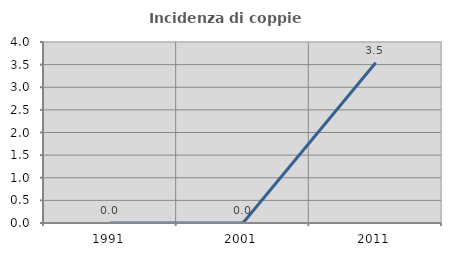
| Category | Incidenza di coppie miste |
|---|---|
| 1991.0 | 0 |
| 2001.0 | 0 |
| 2011.0 | 3.54 |